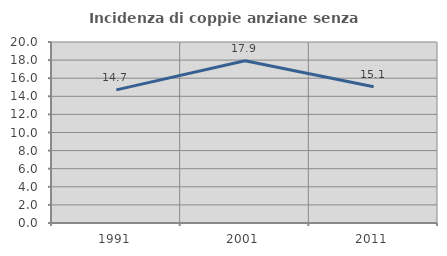
| Category | Incidenza di coppie anziane senza figli  |
|---|---|
| 1991.0 | 14.706 |
| 2001.0 | 17.919 |
| 2011.0 | 15.056 |